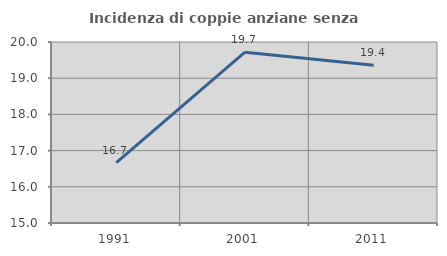
| Category | Incidenza di coppie anziane senza figli  |
|---|---|
| 1991.0 | 16.667 |
| 2001.0 | 19.718 |
| 2011.0 | 19.355 |